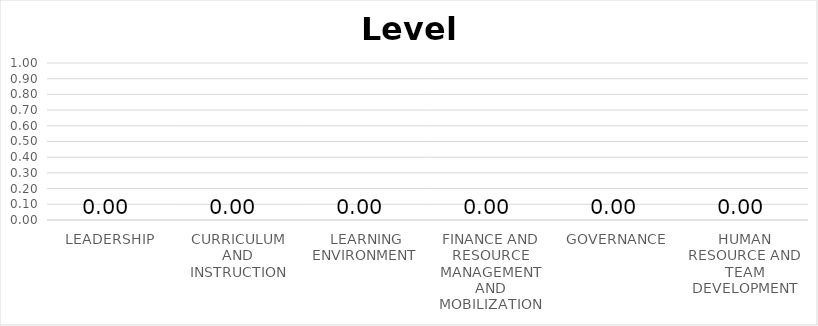
| Category | Series 8 |
|---|---|
| LEADERSHIP | 0 |
| CURRICULUM AND INSTRUCTION | 0 |
|  LEARNING ENVIRONMENT | 0 |
| FINANCE AND RESOURCE MANAGEMENT AND MOBILIZATION | 0 |
| GOVERNANCE | 0 |
| HUMAN RESOURCE AND TEAM DEVELOPMENT | 0 |